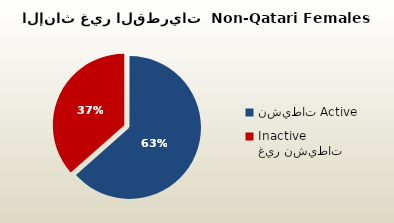
| Category | الاناث غير القطريات  Non-Qatari Females |
|---|---|
| نشيطات Active | 239832 |
| غير نشيطات Inactive | 138117 |